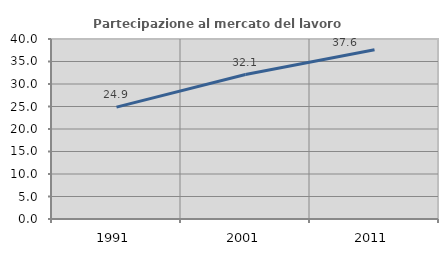
| Category | Partecipazione al mercato del lavoro  femminile |
|---|---|
| 1991.0 | 24.852 |
| 2001.0 | 32.099 |
| 2011.0 | 37.621 |